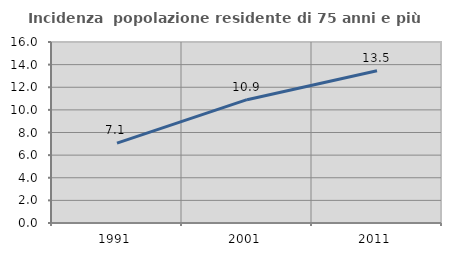
| Category | Incidenza  popolazione residente di 75 anni e più |
|---|---|
| 1991.0 | 7.06 |
| 2001.0 | 10.9 |
| 2011.0 | 13.462 |